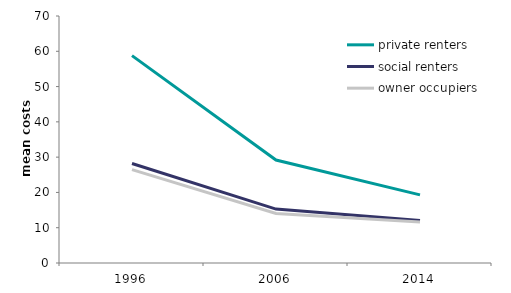
| Category | private renters | social renters | owner occupiers |
|---|---|---|---|
| 1996.0 | 58.78 | 28.194 | 26.461 |
| 2006.0 | 29.174 | 15.271 | 14.058 |
| 2014.0 | 19.317 | 12.062 | 11.588 |